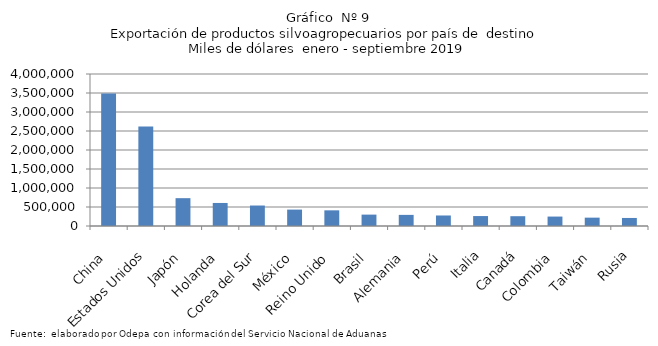
| Category | Series 0 |
|---|---|
| China | 3488226.061 |
| Estados Unidos | 2621343.6 |
| Japón | 732285.342 |
| Holanda | 606215.411 |
| Corea del Sur | 538865.886 |
| México | 431649.195 |
| Reino Unido | 412366.326 |
| Brasil | 299653.17 |
| Alemania | 292533.753 |
| Perú | 276767.326 |
| Italia | 261702.251 |
| Canadá | 258023.123 |
| Colombia | 248268.159 |
| Taiwán | 219730.926 |
| Rusia | 211589.381 |